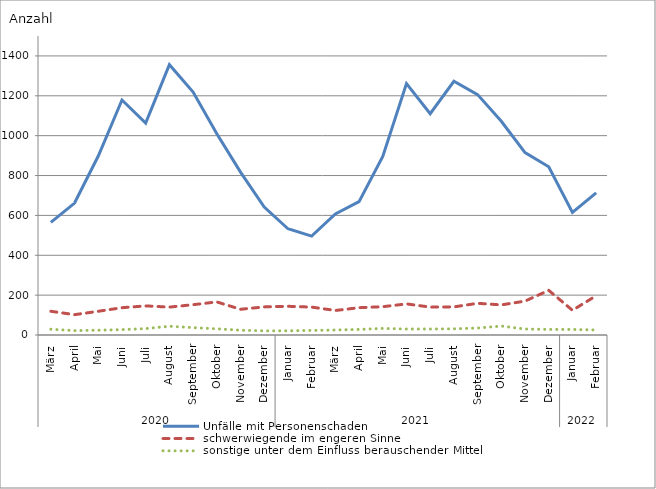
| Category | Unfälle mit Personenschaden | schwerwiegende im engeren Sinne | sonstige unter dem Einfluss berauschender Mittel |
|---|---|---|---|
| 0 | 565 | 119 | 29 |
| 1 | 662 | 102 | 22 |
| 2 | 898 | 119 | 24 |
| 3 | 1179 | 137 | 27 |
| 4 | 1063 | 146 | 32 |
| 5 | 1356 | 140 | 44 |
| 6 | 1219 | 152 | 37 |
| 7 | 1010 | 166 | 31 |
| 8 | 817 | 129 | 24 |
| 9 | 642 | 141 | 21 |
| 10 | 533 | 144 | 21 |
| 11 | 496 | 140 | 23 |
| 12 | 607 | 123 | 25 |
| 13 | 669 | 137 | 28 |
| 14 | 896 | 142 | 33 |
| 15 | 1261 | 156 | 30 |
| 16 | 1110 | 140 | 30 |
| 17 | 1273 | 141 | 31 |
| 18 | 1206 | 159 | 35 |
| 19 | 1072 | 151 | 45 |
| 20 | 915 | 170 | 30 |
| 21 | 844 | 224 | 28 |
| 22 | 615 | 124 | 28 |
| 23 | 713 | 197 | 25 |